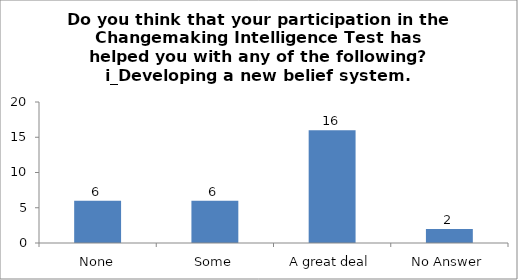
| Category | Do you think that your participation in the Changemaking Intelligence Test has helped you with any of the following?
i_Developing a new belief system. |
|---|---|
| None | 6 |
| Some | 6 |
| A great deal | 16 |
| No Answer | 2 |